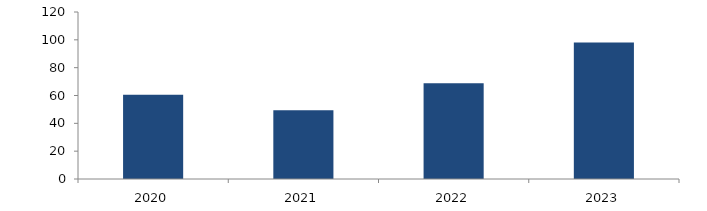
| Category | Bogotá |
|---|---|
| 2020.0 | 60.465 |
| 2021.0 | 49.439 |
| 2022.0 | 68.75 |
| 2023.0 | 98.112 |